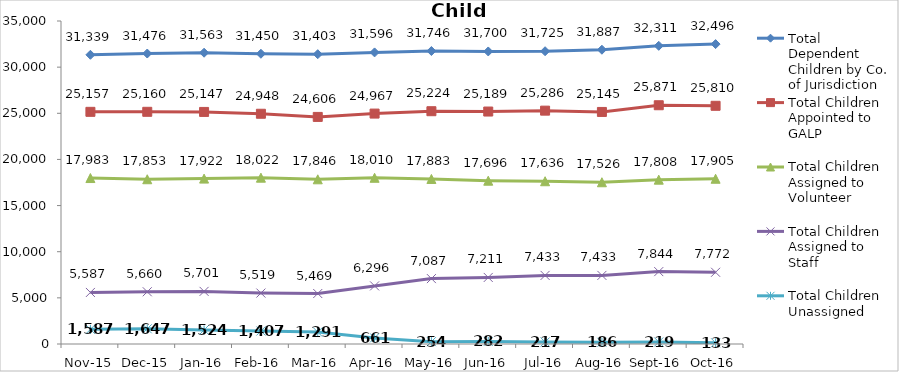
| Category | Total Dependent Children by Co. of Jurisdiction | Total Children Appointed to GALP | Total Children Assigned to Volunteer | Total Children Assigned to Staff | Total Children Unassigned |
|---|---|---|---|---|---|
| Nov-15 | 31339 | 25157 | 17983 | 5587 | 1587 |
| Dec-15 | 31476 | 25160 | 17853 | 5660 | 1647 |
| Jan-16 | 31563 | 25147 | 17922 | 5701 | 1524 |
| Feb-16 | 31450 | 24948 | 18022 | 5519 | 1407 |
| Mar-16 | 31403 | 24606 | 17846 | 5469 | 1291 |
| Apr-16 | 31596 | 24967 | 18010 | 6296 | 661 |
| May-16 | 31746 | 25224 | 17883 | 7087 | 254 |
| Jun-16 | 31700 | 25189 | 17696 | 7211 | 282 |
| Jul-16 | 31725 | 25286 | 17636 | 7433 | 217 |
| Aug-16 | 31887 | 25145 | 17526 | 7433 | 186 |
| Sep-16 | 32311 | 25871 | 17808 | 7844 | 219 |
| Oct-16 | 32496 | 25810 | 17905 | 7772 | 133 |